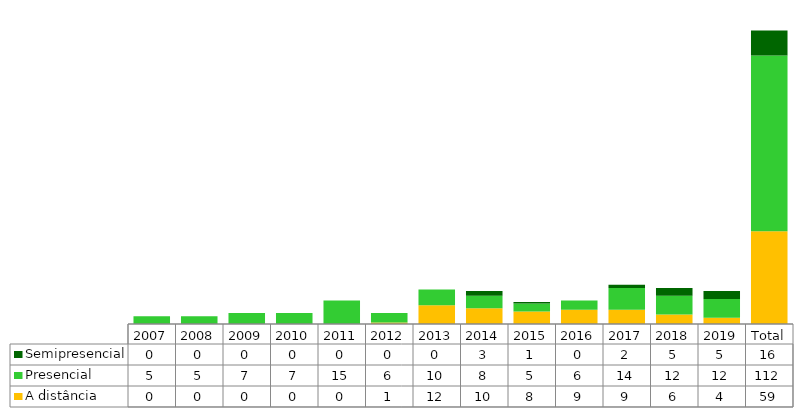
| Category | A distância | Presencial | Semipresencial |
|---|---|---|---|
| 2007 | 0 | 5 | 0 |
| 2008 | 0 | 5 | 0 |
| 2009 | 0 | 7 | 0 |
| 2010 | 0 | 7 | 0 |
| 2011 | 0 | 15 | 0 |
| 2012 | 1 | 6 | 0 |
| 2013 | 12 | 10 | 0 |
| 2014 | 10 | 8 | 3 |
| 2015 | 8 | 5 | 1 |
| 2016 | 9 | 6 | 0 |
| 2017 | 9 | 14 | 2 |
| 2018 | 6 | 12 | 5 |
| 2019 | 4 | 12 | 5 |
| Total | 59 | 112 | 16 |